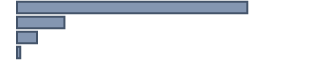
| Category | Series 0 |
|---|---|
| 0 | 76.515 |
| 1 | 15.758 |
| 2 | 6.667 |
| 3 | 1.061 |